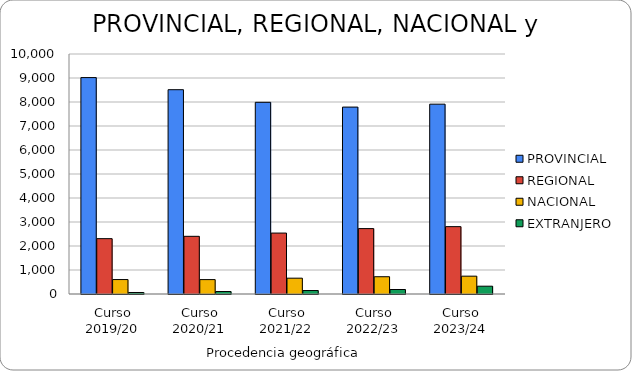
| Category | PROVINCIAL | REGIONAL | NACIONAL | EXTRANJERO |
|---|---|---|---|---|
| Curso 2019/20 | 9017 | 2306 | 602 | 63 |
| Curso 2020/21 | 8513 | 2403 | 600 | 103 |
| Curso 2021/22 | 7987 | 2539 | 659 | 145 |
| Curso 2022/23 | 7788 | 2725 | 720 | 187 |
| Curso 2023/24 | 7910 | 2807 | 743 | 325 |